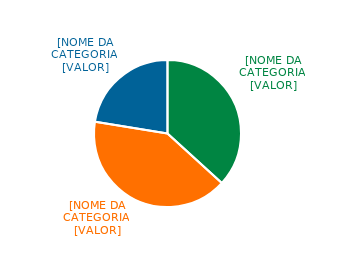
| Category | Series 0 |
|---|---|
| Grupo de controle | 0.367 |
| Investidores não-brasileiros * | 0.408 |
| Investidores brasileiros * | 0.224 |